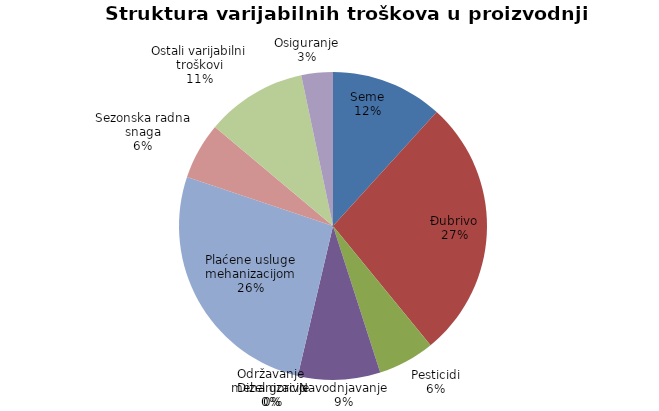
| Category | Series 0 |
|---|---|
| Seme | 8880 |
| Đubrivo | 20650 |
| Pesticidi | 4500 |
| Navodnjavanje | 6525 |
| Dizel gorivo | 0 |
| Održavanje mehanizacije | 0 |
| Plaćene usluge mehanizacijom | 20000 |
| Sezonska radna snaga | 4500 |
| Ostali varijabilni troškovi | 8000 |
| Osiguranje | 2500 |